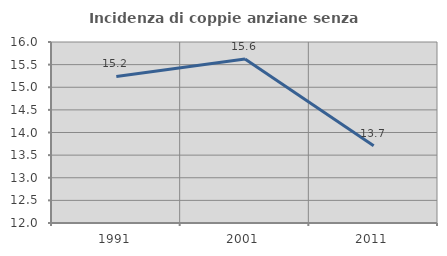
| Category | Incidenza di coppie anziane senza figli  |
|---|---|
| 1991.0 | 15.238 |
| 2001.0 | 15.625 |
| 2011.0 | 13.71 |